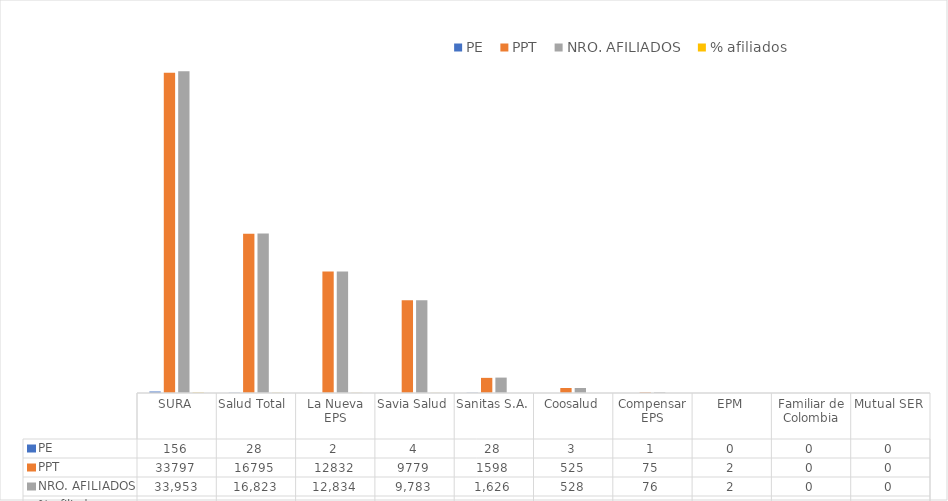
| Category | PE | PPT | NRO. AFILIADOS | % afiliados |
|---|---|---|---|---|
| SURA | 156 | 33797 | 33953 | 44.897 |
| Salud Total  | 28 | 16795 | 16823 | 22.245 |
| La Nueva EPS | 2 | 12832 | 12834 | 16.971 |
| Savia Salud | 4 | 9779 | 9783 | 12.936 |
| Sanitas S.A. | 28 | 1598 | 1626 | 2.15 |
| Coosalud | 3 | 525 | 528 | 0.698 |
| Compensar EPS | 1 | 75 | 76 | 0.1 |
| EPM | 0 | 2 | 2 | 0.003 |
| Familiar de Colombia | 0 | 0 | 0 | 0 |
| Mutual SER | 0 | 0 | 0 | 0 |